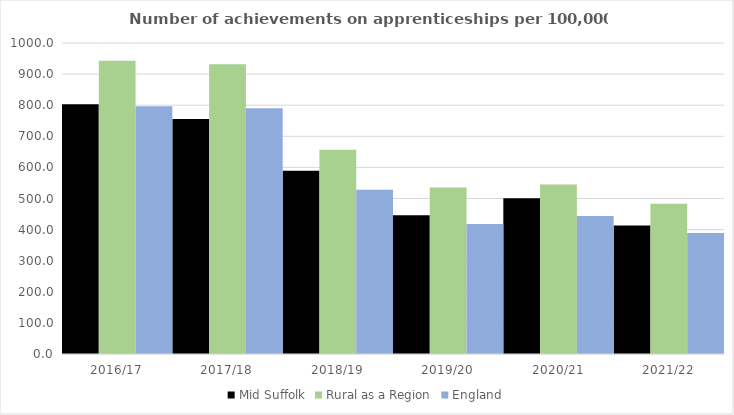
| Category | Mid Suffolk | Rural as a Region | England |
|---|---|---|---|
| 2016/17 | 803 | 942.594 | 797 |
| 2017/18 | 756 | 931.709 | 790 |
| 2018/19 | 589 | 656.44 | 528 |
| 2019/20 | 446 | 535.552 | 418 |
| 2020/21 | 501 | 545.333 | 444 |
| 2021/22 | 413 | 482.936 | 389 |